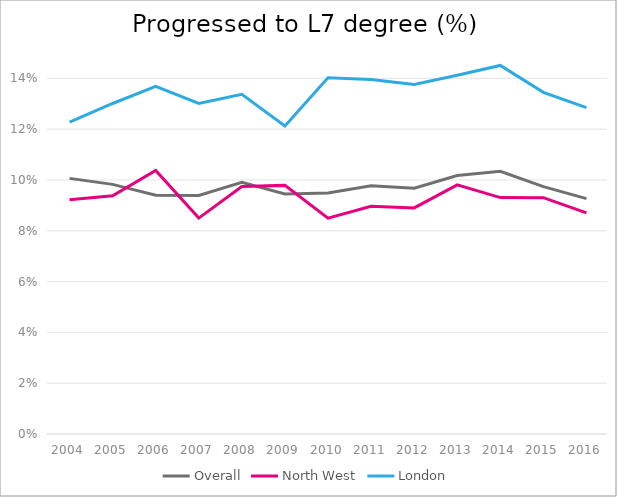
| Category | Overall | North West | London |
|---|---|---|---|
| 2004.0 | 0.101 | 0.092 | 0.123 |
| 2005.0 | 0.098 | 0.094 | 0.13 |
| 2006.0 | 0.094 | 0.104 | 0.137 |
| 2007.0 | 0.094 | 0.085 | 0.13 |
| 2008.0 | 0.099 | 0.097 | 0.134 |
| 2009.0 | 0.095 | 0.098 | 0.121 |
| 2010.0 | 0.095 | 0.085 | 0.14 |
| 2011.0 | 0.098 | 0.09 | 0.14 |
| 2012.0 | 0.097 | 0.089 | 0.138 |
| 2013.0 | 0.102 | 0.098 | 0.141 |
| 2014.0 | 0.103 | 0.093 | 0.145 |
| 2015.0 | 0.097 | 0.093 | 0.135 |
| 2016.0 | 0.093 | 0.087 | 0.128 |